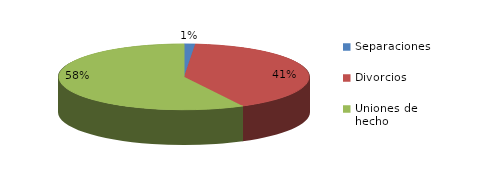
| Category | Series 0 |
|---|---|
| Separaciones | 53 |
| Divorcios | 1541 |
| Uniones de hecho | 2177 |